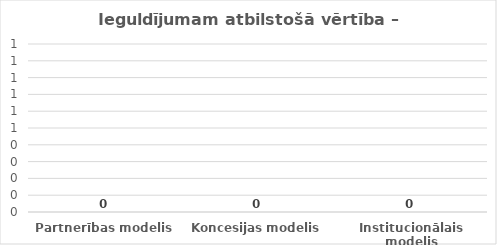
| Category | Series 0 |
|---|---|
| Partnerības modelis | 0 |
| Koncesijas modelis | 0 |
| Institucionālais modelis | 0 |